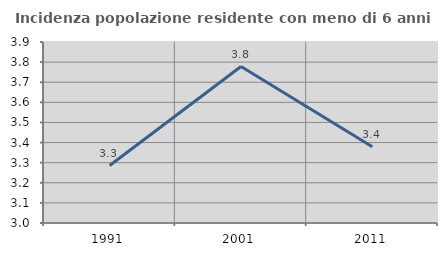
| Category | Incidenza popolazione residente con meno di 6 anni |
|---|---|
| 1991.0 | 3.286 |
| 2001.0 | 3.778 |
| 2011.0 | 3.379 |